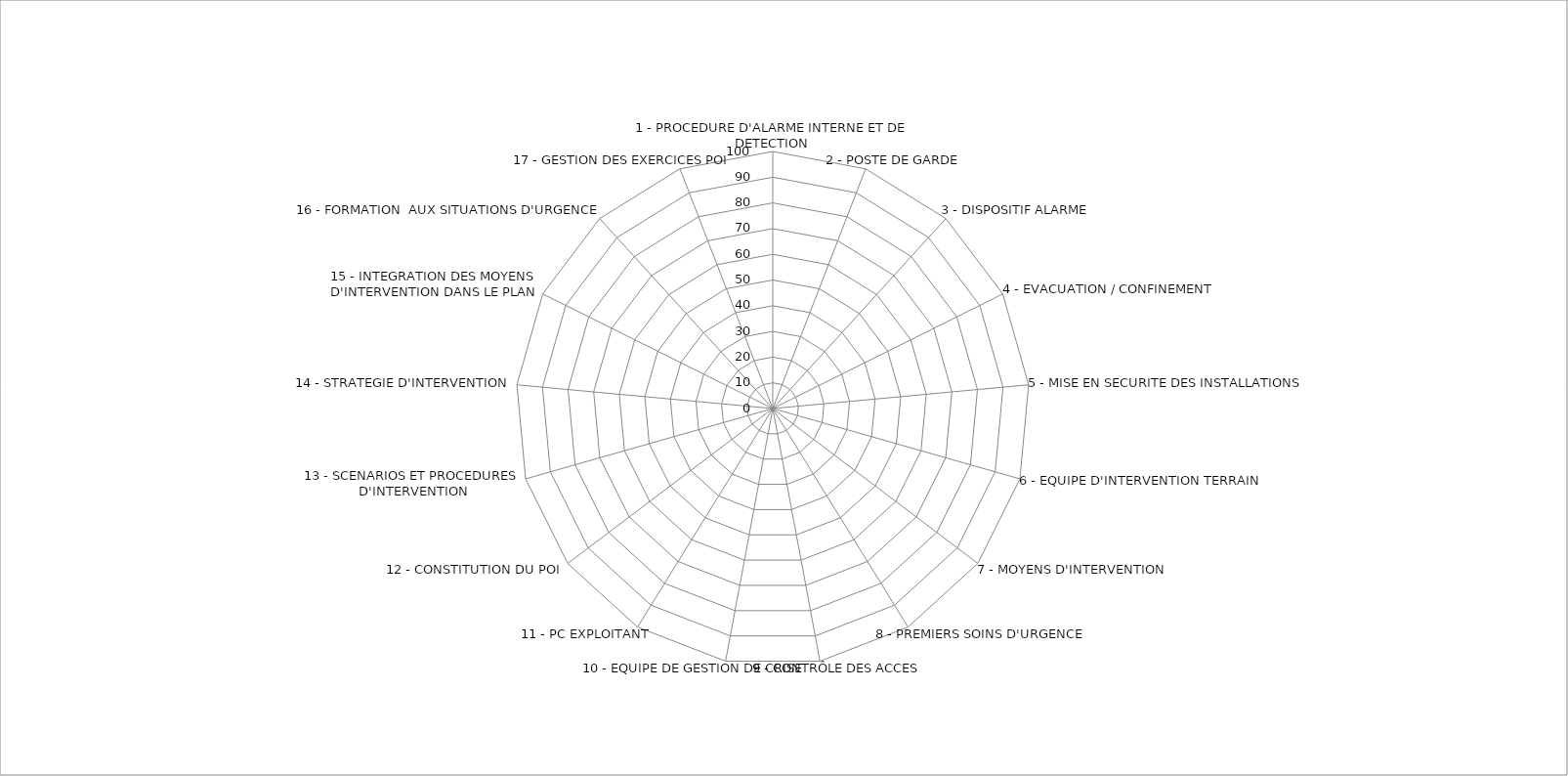
| Category | 0 0 0 0 0 0 0 0 0 0 0 0 0 0 0 0 0 |
|---|---|
|  1 - PROCEDURE D'ALARME INTERNE ET DE DETECTION | 0 |
| 2 - POSTE DE GARDE   | 0 |
| 3 - DISPOSITIF ALARME | 0 |
| 4 - EVACUATION / CONFINEMENT | 0 |
| 5 - MISE EN SECURITE DES INSTALLATIONS | 0 |
| 6 - EQUIPE D'INTERVENTION TERRAIN | 0 |
| 7 - MOYENS D'INTERVENTION | 0 |
| 8 - PREMIERS SOINS D'URGENCE | 0 |
| 9 - CONTRÔLE DES ACCES | 0 |
| 10 - EQUIPE DE GESTION DE CRISE | 0 |
| 11 - PC EXPLOITANT | 0 |
| 12 - CONSTITUTION DU POI | 0 |
| 13 - SCENARIOS ET PROCEDURES D'INTERVENTION | 0 |
| 14 - STRATEGIE D'INTERVENTION | 0 |
| 15 - INTEGRATION DES MOYENS D'INTERVENTION DANS LE PLAN | 0 |
| 16 - FORMATION  AUX SITUATIONS D'URGENCE | 0 |
| 17 - GESTION DES EXERCICES POI | 0 |